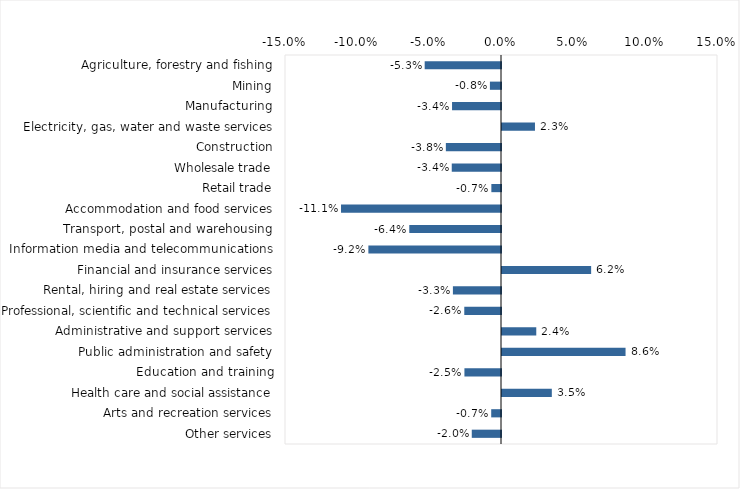
| Category | This week |
|---|---|
| Agriculture, forestry and fishing | -0.053 |
| Mining | -0.008 |
| Manufacturing | -0.034 |
| Electricity, gas, water and waste services | 0.023 |
| Construction | -0.038 |
| Wholesale trade | -0.034 |
| Retail trade | -0.007 |
| Accommodation and food services | -0.111 |
| Transport, postal and warehousing | -0.064 |
| Information media and telecommunications | -0.092 |
| Financial and insurance services | 0.062 |
| Rental, hiring and real estate services | -0.033 |
| Professional, scientific and technical services | -0.026 |
| Administrative and support services | 0.024 |
| Public administration and safety | 0.086 |
| Education and training | -0.025 |
| Health care and social assistance | 0.035 |
| Arts and recreation services | -0.007 |
| Other services | -0.02 |